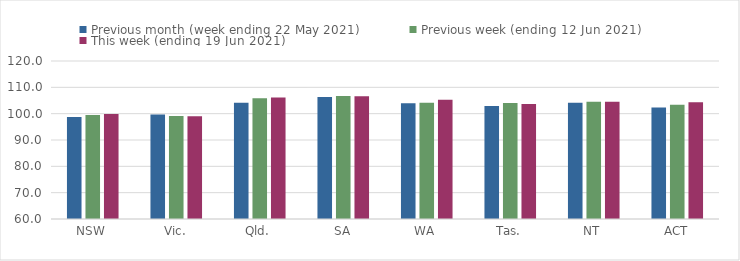
| Category | Previous month (week ending 22 May 2021) | Previous week (ending 12 Jun 2021) | This week (ending 19 Jun 2021) |
|---|---|---|---|
| NSW | 98.7 | 99.54 | 99.85 |
| Vic. | 99.67 | 99.1 | 98.98 |
| Qld. | 104.16 | 105.81 | 106.18 |
| SA | 106.34 | 106.71 | 106.57 |
| WA | 103.96 | 104.18 | 105.31 |
| Tas. | 102.95 | 104.01 | 103.69 |
| NT | 104.12 | 104.51 | 104.55 |
| ACT | 102.32 | 103.35 | 104.3 |